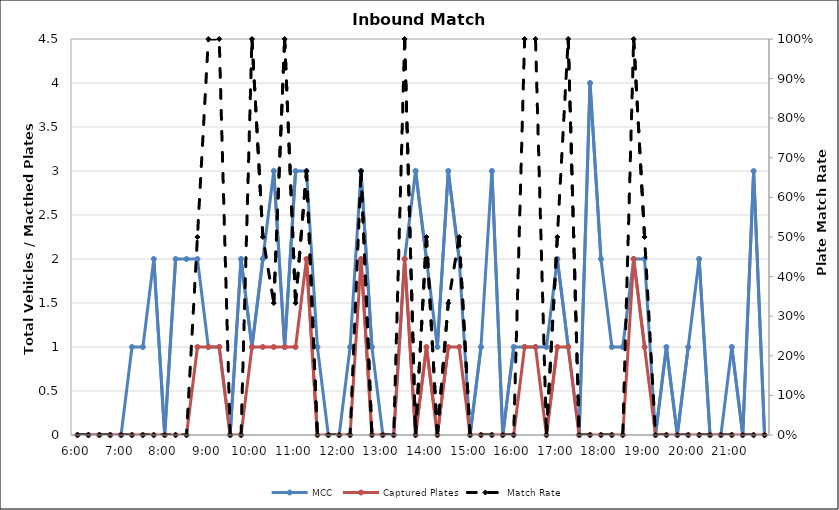
| Category | MCC | Captured Plates |
|---|---|---|
| 0.25 | 0 | 0 |
| 0.260416666666667 | 0 | 0 |
| 0.270833333333333 | 0 | 0 |
| 0.28125 | 0 | 0 |
| 0.291666666666667 | 0 | 0 |
| 0.302083333333333 | 1 | 0 |
| 0.3125 | 1 | 0 |
| 0.322916666666667 | 2 | 0 |
| 0.333333333333333 | 0 | 0 |
| 0.34375 | 2 | 0 |
| 0.354166666666667 | 2 | 0 |
| 0.364583333333333 | 2 | 1 |
| 0.375 | 1 | 1 |
| 0.385416666666667 | 1 | 1 |
| 0.395833333333333 | 0 | 0 |
| 0.40625 | 2 | 0 |
| 0.416666666666667 | 1 | 1 |
| 0.427083333333333 | 2 | 1 |
| 0.4375 | 3 | 1 |
| 0.447916666666667 | 1 | 1 |
| 0.458333333333333 | 3 | 1 |
| 0.46875 | 3 | 2 |
| 0.479166666666667 | 1 | 0 |
| 0.489583333333333 | 0 | 0 |
| 0.5 | 0 | 0 |
| 0.510416666666667 | 1 | 0 |
| 0.520833333333333 | 3 | 2 |
| 0.53125 | 1 | 0 |
| 0.541666666666667 | 0 | 0 |
| 0.552083333333333 | 0 | 0 |
| 0.5625 | 2 | 2 |
| 0.572916666666667 | 3 | 0 |
| 0.583333333333333 | 2 | 1 |
| 0.59375 | 1 | 0 |
| 0.604166666666667 | 3 | 1 |
| 0.614583333333333 | 2 | 1 |
| 0.625 | 0 | 0 |
| 0.635416666666667 | 1 | 0 |
| 0.645833333333333 | 3 | 0 |
| 0.65625 | 0 | 0 |
| 0.666666666666667 | 1 | 0 |
| 0.677083333333333 | 1 | 1 |
| 0.6875 | 1 | 1 |
| 0.697916666666667 | 1 | 0 |
| 0.708333333333333 | 2 | 1 |
| 0.71875 | 1 | 1 |
| 0.729166666666667 | 0 | 0 |
| 0.739583333333333 | 4 | 0 |
| 0.75 | 2 | 0 |
| 0.760416666666667 | 1 | 0 |
| 0.770833333333333 | 1 | 0 |
| 0.78125 | 2 | 2 |
| 0.791666666666667 | 2 | 1 |
| 0.802083333333333 | 0 | 0 |
| 0.8125 | 1 | 0 |
| 0.822916666666667 | 0 | 0 |
| 0.833333333333333 | 1 | 0 |
| 0.84375 | 2 | 0 |
| 0.854166666666667 | 0 | 0 |
| 0.864583333333333 | 0 | 0 |
| 0.875 | 1 | 0 |
| 0.885416666666667 | 0 | 0 |
| 0.895833333333333 | 3 | 0 |
| 0.90625 | 0 | 0 |